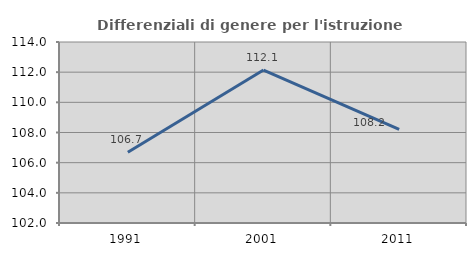
| Category | Differenziali di genere per l'istruzione superiore |
|---|---|
| 1991.0 | 106.696 |
| 2001.0 | 112.142 |
| 2011.0 | 108.203 |